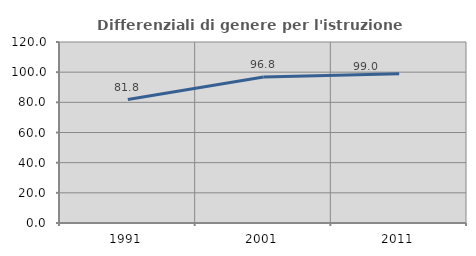
| Category | Differenziali di genere per l'istruzione superiore |
|---|---|
| 1991.0 | 81.819 |
| 2001.0 | 96.839 |
| 2011.0 | 99.026 |